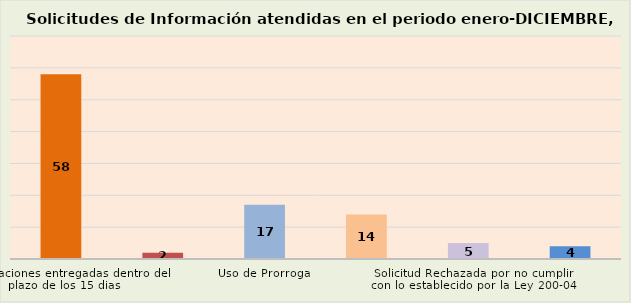
| Category | Series 0 |
|---|---|
| Informaciones entregadas dentro del plazo de los 15 dias | 58 |
| Solicitud sin responder (estamos dentro del plazo) | 2 |
| Uso de Prorroga  | 17 |
| Remitidas a otras institucines competentes  | 14 |
| Solicitud Rechazada por no cumplir con lo establecido por la Ley 200-04 | 5 |
| Rechazada por el ciudadano | 4 |